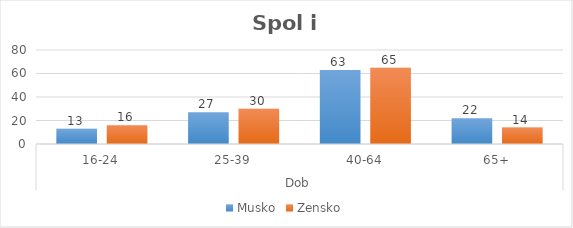
| Category | Musko | Zensko |
|---|---|---|
| 0 | 13 | 16 |
| 1 | 27 | 30 |
| 2 | 63 | 65 |
| 3 | 22 | 14 |